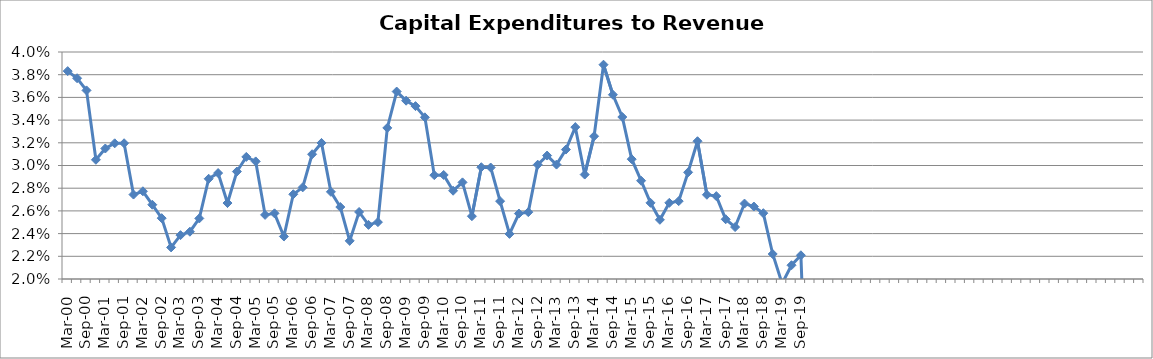
| Category | Series 0 |
|---|---|
| Mar-00 | 0.038 |
| Jun-00 | 0.038 |
| Sep-00 | 0.037 |
| Dec-00 | 0.031 |
| Mar-01 | 0.031 |
| Jun-01 | 0.032 |
| Sep-01 | 0.032 |
| Dec-01 | 0.027 |
| Mar-02 | 0.028 |
| Jun-02 | 0.027 |
| Sep-02 | 0.025 |
| Dec-02 | 0.023 |
| Mar-03 | 0.024 |
| Jun-03 | 0.024 |
| Sep-03 | 0.025 |
| Dec-03 | 0.029 |
| Mar-04 | 0.029 |
| Jun-04 | 0.027 |
| Sep-04 | 0.029 |
| Dec-04 | 0.031 |
| Mar-05 | 0.03 |
| Jun-05 | 0.026 |
| Sep-05 | 0.026 |
| Dec-05 | 0.024 |
| Mar-06 | 0.027 |
| Jun-06 | 0.028 |
| Sep-06 | 0.031 |
| Dec-06 | 0.032 |
| Mar-07 | 0.028 |
| Jun-07 | 0.026 |
| Sep-07 | 0.023 |
| Dec-07 | 0.026 |
| Mar-08 | 0.025 |
| Jun-08 | 0.025 |
| Sep-08 | 0.033 |
| Dec-08 | 0.037 |
| Mar-09 | 0.036 |
| Jun-09 | 0.035 |
| Sep-09 | 0.034 |
| Dec-09 | 0.029 |
| Mar-10 | 0.029 |
| Jun-10 | 0.028 |
| Sep-10 | 0.029 |
| Dec-10 | 0.026 |
| Mar-11 | 0.03 |
| Jun-11 | 0.03 |
| Sep-11 | 0.027 |
| Dec-11 | 0.024 |
| Mar-12 | 0.026 |
| Jun-12 | 0.026 |
| Sep-12 | 0.03 |
| Dec-12 | 0.031 |
| Mar-13 | 0.03 |
| Jun-13 | 0.031 |
| Sep-13 | 0.033 |
| Dec-13 | 0.029 |
| Mar-14 | 0.033 |
| Jun-14 | 0.039 |
| Sep-14 | 0.036 |
| Dec-14 | 0.034 |
| Mar-15 | 0.031 |
| Jun-15 | 0.029 |
| Sep-15 | 0.027 |
| Dec-15 | 0.025 |
| Mar-16 | 0.027 |
| Jun-16 | 0.027 |
| Sep-16 | 0.029 |
| Dec-16 | 0.032 |
| Mar-17 | 0.027 |
| Jun-17 | 0.027 |
| Sep-17 | 0.025 |
| Dec-17 | 0.025 |
| Mar-18 | 0.027 |
| Jun-18 | 0.026 |
| Sep-18 | 0.026 |
| Dec-18 | 0.022 |
| Mar-19 | 0.02 |
| Jun-19 | 0.021 |
| Sep-19 | 0.022 |